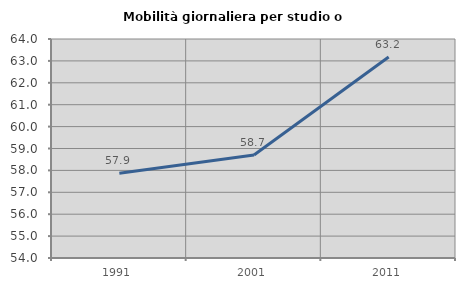
| Category | Mobilità giornaliera per studio o lavoro |
|---|---|
| 1991.0 | 57.87 |
| 2001.0 | 58.704 |
| 2011.0 | 63.175 |